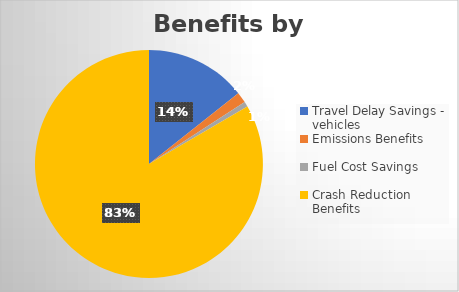
| Category | Series 0 |
|---|---|
| Travel Delay Savings - vehicles | 0.143 |
| Emissions Benefits  | 0.015 |
| Fuel Cost Savings | 0.007 |
| Crash Reduction Benefits | 0.834 |